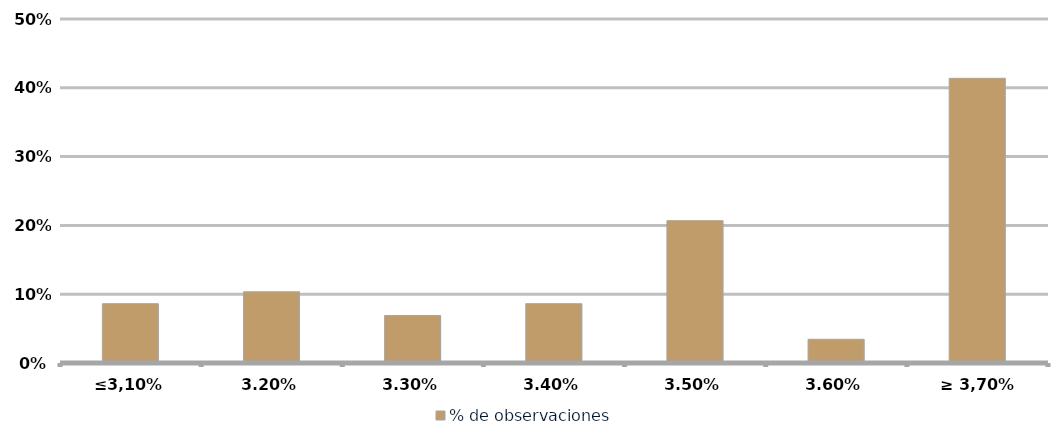
| Category | % de observaciones  |
|---|---|
|  ≤3,10%  | 0.086 |
| 3,20% | 0.103 |
| 3,30% | 0.069 |
| 3,40% | 0.086 |
| 3,50% | 0.207 |
| 3,60% | 0.034 |
| ≥ 3,70% | 0.414 |